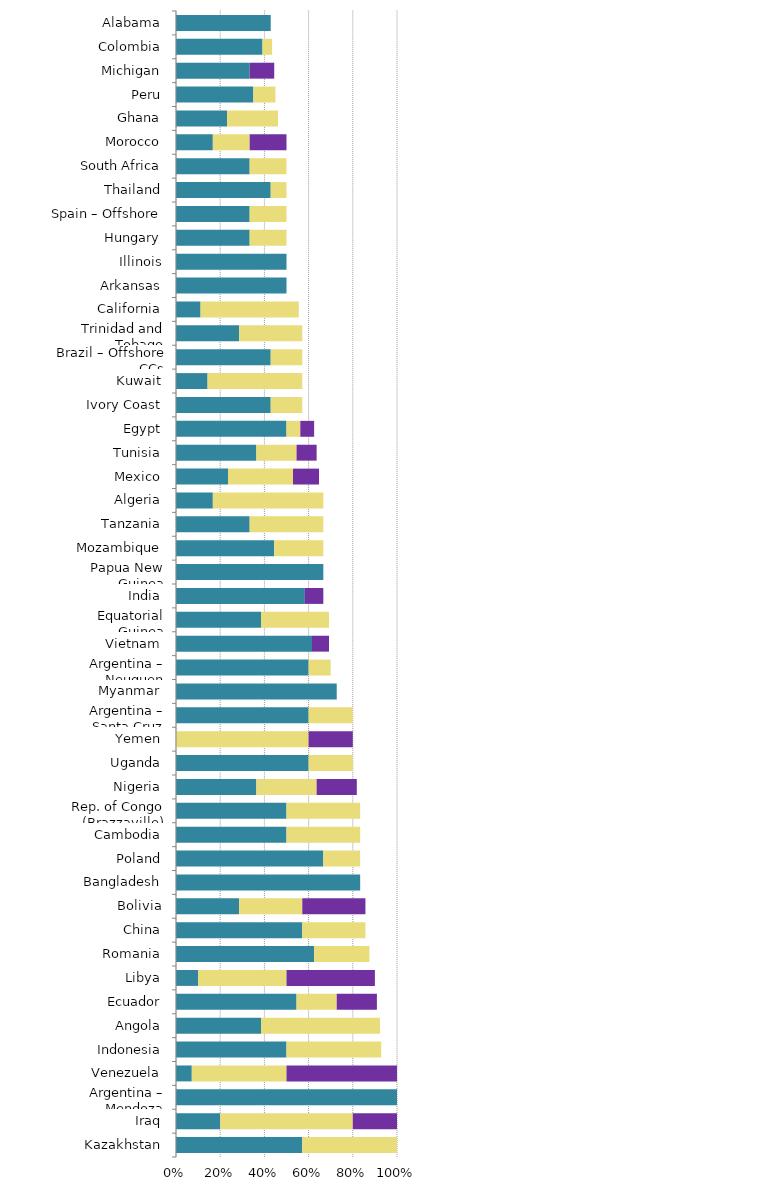
| Category | Mild deterrent to investment | Strong deterrent to investment | Would not pursue investment due to this factor |
|---|---|---|---|
| Kazakhstan | 0.571 | 0.429 | 0 |
| Iraq | 0.2 | 0.6 | 0.2 |
| Argentina – Mendoza | 1 | 0 | 0 |
| Venezuela | 0.071 | 0.429 | 0.5 |
| Indonesia | 0.5 | 0.429 | 0 |
| Angola | 0.385 | 0.538 | 0 |
| Ecuador | 0.545 | 0.182 | 0.182 |
| Libya | 0.1 | 0.4 | 0.4 |
| Romania | 0.625 | 0.25 | 0 |
| China | 0.571 | 0.286 | 0 |
| Bolivia | 0.286 | 0.286 | 0.286 |
| Bangladesh | 0.833 | 0 | 0 |
| Poland | 0.667 | 0.167 | 0 |
| Cambodia | 0.5 | 0.333 | 0 |
| Rep. of Congo (Brazzaville) | 0.5 | 0.333 | 0 |
| Nigeria | 0.364 | 0.273 | 0.182 |
| Uganda | 0.6 | 0.2 | 0 |
| Yemen | 0 | 0.6 | 0.2 |
| Argentina – Santa Cruz | 0.6 | 0.2 | 0 |
| Myanmar | 0.727 | 0 | 0 |
| Argentina – Neuquen | 0.6 | 0.1 | 0 |
| Vietnam | 0.615 | 0 | 0.077 |
| Equatorial Guinea | 0.385 | 0.308 | 0 |
| India | 0.583 | 0 | 0.083 |
| Papua New Guinea | 0.667 | 0 | 0 |
| Mozambique | 0.444 | 0.222 | 0 |
| Tanzania | 0.333 | 0.333 | 0 |
| Algeria | 0.167 | 0.5 | 0 |
| Mexico | 0.235 | 0.294 | 0.118 |
| Tunisia | 0.364 | 0.182 | 0.091 |
| Egypt | 0.5 | 0.062 | 0.062 |
| Ivory Coast | 0.429 | 0.143 | 0 |
| Kuwait | 0.143 | 0.429 | 0 |
| Brazil – Offshore CCs | 0.429 | 0.143 | 0 |
| Trinidad and Tobago | 0.286 | 0.286 | 0 |
| California | 0.111 | 0.444 | 0 |
| Arkansas | 0.5 | 0 | 0 |
| Illinois | 0.5 | 0 | 0 |
| Hungary | 0.333 | 0.167 | 0 |
| Spain – Offshore | 0.333 | 0.167 | 0 |
| Thailand | 0.429 | 0.071 | 0 |
| South Africa | 0.333 | 0.167 | 0 |
| Morocco | 0.167 | 0.167 | 0.167 |
| Ghana | 0.231 | 0.231 | 0 |
| Peru | 0.35 | 0.1 | 0 |
| Michigan | 0.333 | 0 | 0.111 |
| Colombia | 0.391 | 0.043 | 0 |
| Alabama | 0.429 | 0 | 0 |